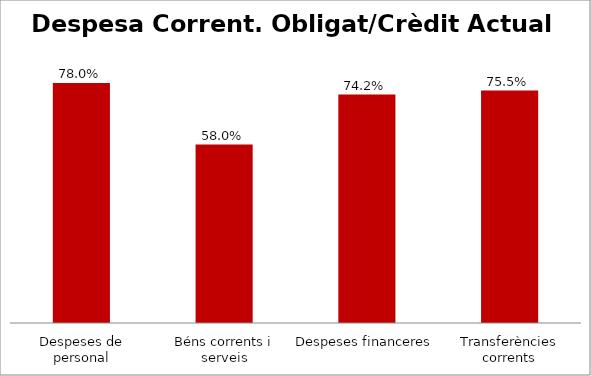
| Category | Series 0 |
|---|---|
| Despeses de personal | 0.78 |
| Béns corrents i serveis | 0.58 |
| Despeses financeres | 0.742 |
| Transferències corrents | 0.755 |